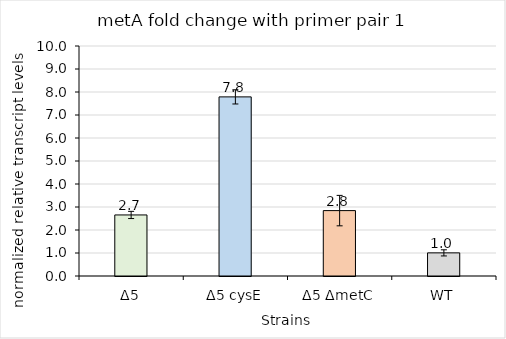
| Category | Series 0 |
|---|---|
| Δ5 | 2.654 |
| Δ5 cysE | 7.788 |
| Δ5 ΔmetC | 2.843 |
| WT | 1.006 |